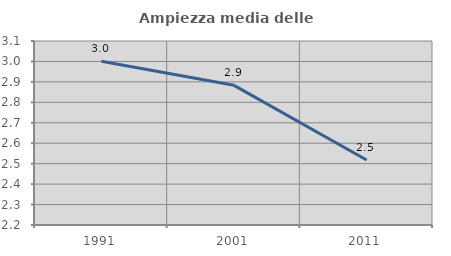
| Category | Ampiezza media delle famiglie |
|---|---|
| 1991.0 | 3 |
| 2001.0 | 2.883 |
| 2011.0 | 2.518 |